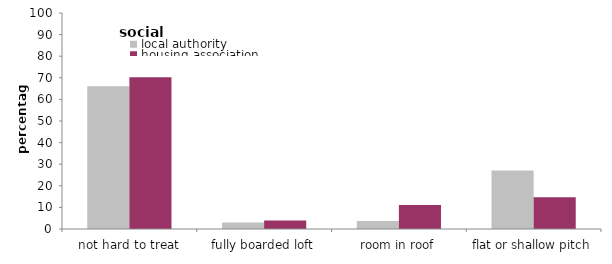
| Category | local authority | housing association |
|---|---|---|
| not hard to treat | 66.134 | 70.311 |
| fully boarded loft | 3.052 | 3.915 |
| room in roof | 3.761 | 11.061 |
| flat or shallow pitch | 27.054 | 14.713 |